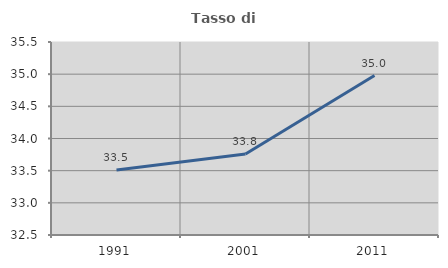
| Category | Tasso di occupazione   |
|---|---|
| 1991.0 | 33.51 |
| 2001.0 | 33.759 |
| 2011.0 | 34.978 |